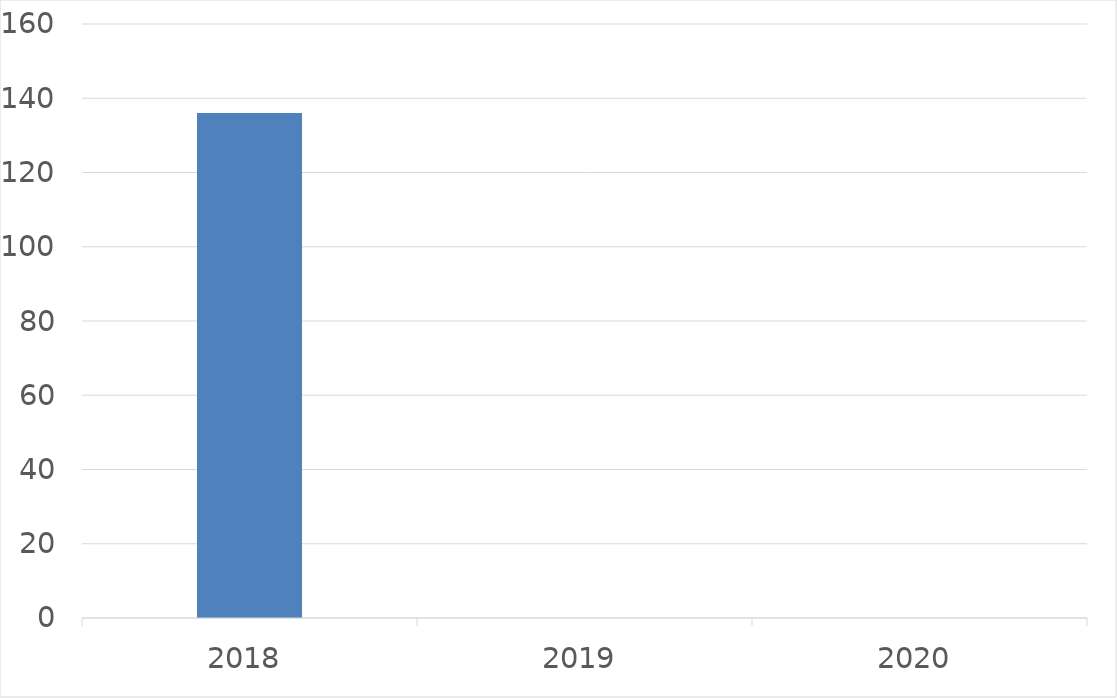
| Category | Series 0 |
|---|---|
| 2018 | 136 |
| 2019 | 0 |
| 2020 | 0 |